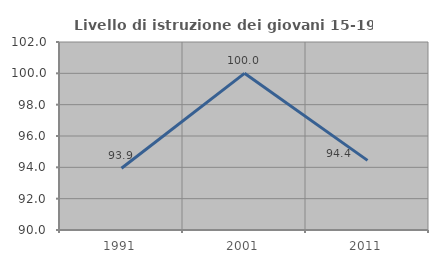
| Category | Livello di istruzione dei giovani 15-19 anni |
|---|---|
| 1991.0 | 93.939 |
| 2001.0 | 100 |
| 2011.0 | 94.444 |